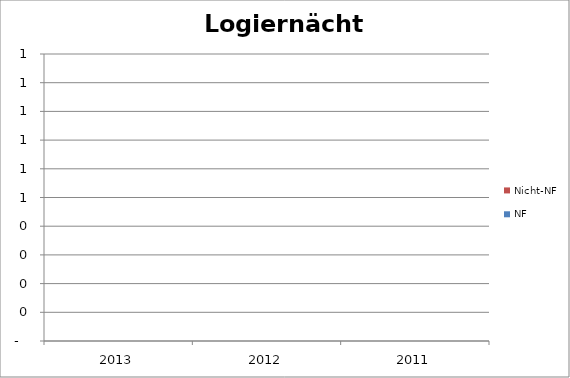
| Category | NF | Nicht-NF |
|---|---|---|
| 2013.0 | 0 | 0 |
| 2012.0 | 0 | 0 |
| 2011.0 | 0 | 0 |